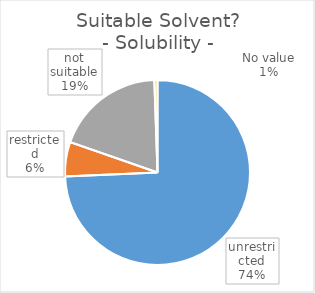
| Category | Series 0 |
|---|---|
| 0 | 136 |
| 1 | 11 |
| 2 | 35 |
| 3 | 1 |